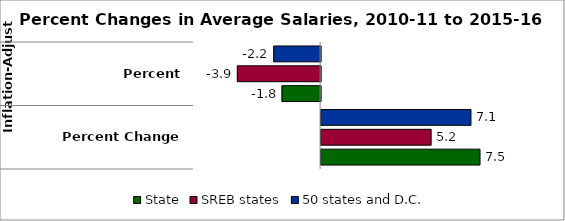
| Category | State | SREB states | 50 states and D.C. |
|---|---|---|---|
| 0 | 7.5 | 5.193 | 7.072 |
| 1 | -1.823 | -3.929 | -2.213 |